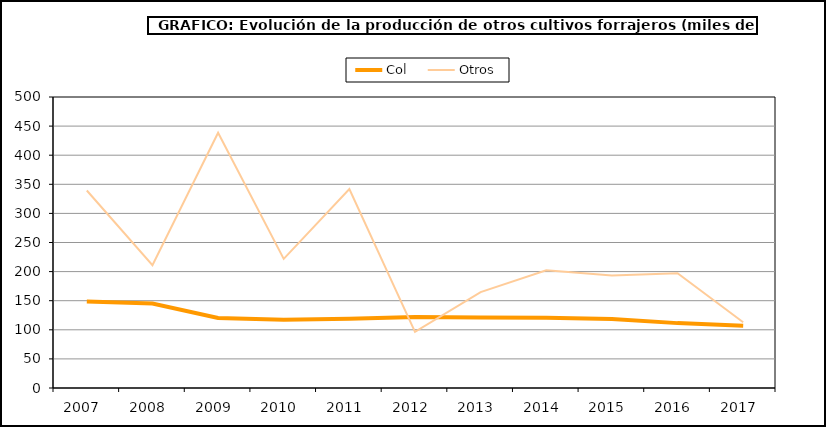
| Category | Col | Otros |
|---|---|---|
| 2007.0 | 148.425 | 339.369 |
| 2008.0 | 145.208 | 211.156 |
| 2009.0 | 120.292 | 438.536 |
| 2010.0 | 117.345 | 221.872 |
| 2011.0 | 118.869 | 341.873 |
| 2012.0 | 122.008 | 96.567 |
| 2013.0 | 121.043 | 164.745 |
| 2014.0 | 120.638 | 202.445 |
| 2015.0 | 118.726 | 193.293 |
| 2016.0 | 111.472 | 197.303 |
| 2017.0 | 107.156 | 112.906 |